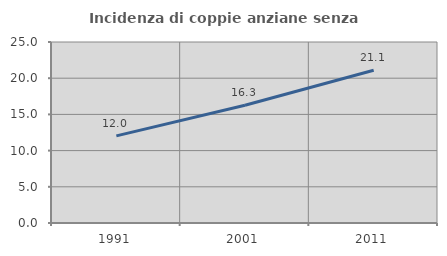
| Category | Incidenza di coppie anziane senza figli  |
|---|---|
| 1991.0 | 12.037 |
| 2001.0 | 16.264 |
| 2011.0 | 21.092 |